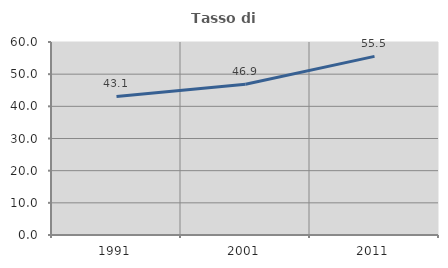
| Category | Tasso di occupazione   |
|---|---|
| 1991.0 | 43.082 |
| 2001.0 | 46.87 |
| 2011.0 | 55.527 |